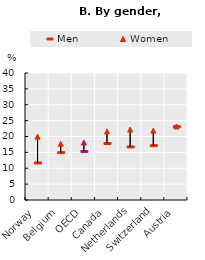
| Category | Men  | Women |
|---|---|---|
| Norway | 11.668 | 19.951 |
| Belgium | 14.93 | 17.725 |
| OECD | 15.289 | 18.089 |
| Canada | 17.8 | 21.6 |
| Netherlands | 16.708 | 22.19 |
| Switzerland | 17.105 | 21.863 |
| Austria | 23.101 | 23.169 |